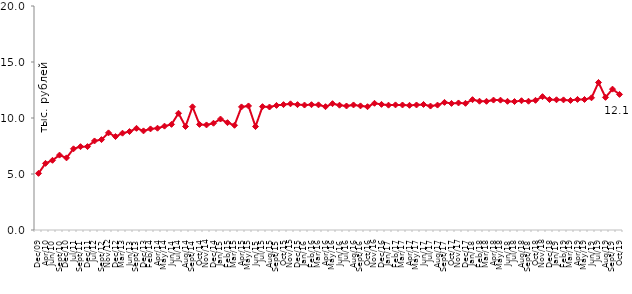
| Category | медианное значение среднедушевого располагаемого дохода, тыс. руб. |
|---|---|
| 2009-12-01 | 5.058 |
| 2010-04-01 | 5.949 |
| 2010-06-01 | 6.224 |
| 2010-09-01 | 6.686 |
| 2010-12-01 | 6.44 |
| 2011-07-01 | 7.25 |
| 2011-09-01 | 7.441 |
| 2011-12-01 | 7.446 |
| 2012-07-01 | 7.95 |
| 2012-09-01 | 8.071 |
| 2012-11-01 | 8.673 |
| 2012-12-01 | 8.345 |
| 2013-03-01 | 8.644 |
| 2013-06-01 | 8.789 |
| 2013-09-01 | 9.079 |
| 2013-12-01 | 8.849 |
| 2014-02-01 | 9.025 |
| 2014-04-01 | 9.087 |
| 2014-05-01 | 9.273 |
| 2014-06-01 | 9.432 |
| 2014-07-01 | 10.422 |
| 2014-08-01 | 9.241 |
| 2014-09-01 | 11 |
| 2014-10-01 | 9.426 |
| 2014-11-01 | 9.381 |
| 2014-12-01 | 9.532 |
| 2015-01-01 | 9.908 |
| 2015-02-01 | 9.585 |
| 2015-03-01 | 9.35 |
| 2015-04-01 | 10.991 |
| 2015-05-01 | 11.076 |
| 2015-06-01 | 9.237 |
| 2015-07-01 | 11.013 |
| 2015-08-01 | 10.981 |
| 2015-09-01 | 11.124 |
| 2015-10-01 | 11.195 |
| 2015-11-01 | 11.268 |
| 2015-12-01 | 11.194 |
| 2016-01-01 | 11.158 |
| 2016-02-01 | 11.188 |
| 2016-03-01 | 11.174 |
| 2016-04-01 | 11.01 |
| 2016-05-01 | 11.278 |
| 2016-06-01 | 11.142 |
| 2016-07-01 | 11.072 |
| 2016-08-01 | 11.165 |
| 2016-09-01 | 11.082 |
| 2016-10-01 | 11.008 |
| 2016-11-01 | 11.313 |
| 2016-12-01 | 11.216 |
| 2017-01-01 | 11.146 |
| 2017-02-01 | 11.17 |
| 2017-03-01 | 11.162 |
| 2017-04-01 | 11.133 |
| 2017-05-01 | 11.163 |
| 2017-06-01 | 11.207 |
| 2017-07-01 | 11.066 |
| 2017-08-01 | 11.153 |
| 2017-09-01 | 11.395 |
| 2017-10-01 | 11.301 |
| 2017-11-01 | 11.342 |
| 2017-12-01 | 11.31 |
| 2018-01-01 | 11.637 |
| 2018-02-01 | 11.497 |
| 2018-03-01 | 11.49 |
| 2018-04-01 | 11.601 |
| 2018-05-01 | 11.592 |
| 2018-06-01 | 11.491 |
| 2018-07-01 | 11.471 |
| 2018-08-01 | 11.541 |
| 2018-09-01 | 11.497 |
| 2018-10-01 | 11.578 |
| 2018-11-01 | 11.906 |
| 2018-12-01 | 11.648 |
| 2019-01-01 | 11.629 |
| 2019-02-01 | 11.617 |
| 2019-03-01 | 11.566 |
| 2019-04-01 | 11.659 |
| 2019-05-01 | 11.653 |
| 2019-06-01 | 11.805 |
| 2019-07-01 | 13.174 |
| 2019-08-01 | 11.844 |
| 2019-09-01 | 12.577 |
| 2019-10-01 | 12.107 |